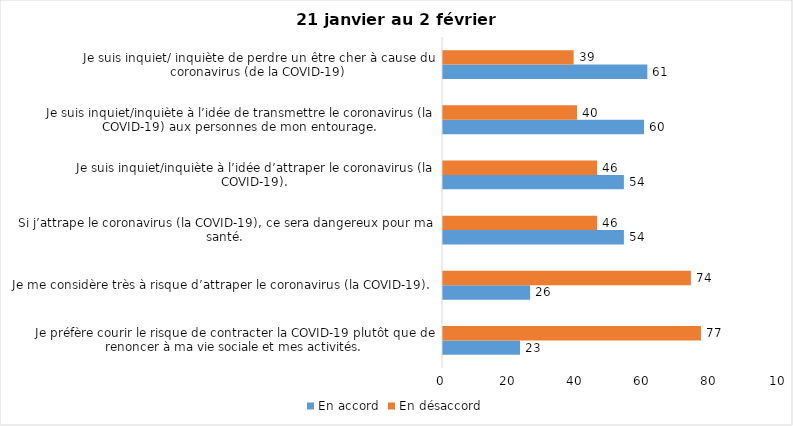
| Category | En accord | En désaccord |
|---|---|---|
| Je préfère courir le risque de contracter la COVID-19 plutôt que de renoncer à ma vie sociale et mes activités. | 23 | 77 |
| Je me considère très à risque d’attraper le coronavirus (la COVID-19). | 26 | 74 |
| Si j’attrape le coronavirus (la COVID-19), ce sera dangereux pour ma santé. | 54 | 46 |
| Je suis inquiet/inquiète à l’idée d’attraper le coronavirus (la COVID-19). | 54 | 46 |
| Je suis inquiet/inquiète à l’idée de transmettre le coronavirus (la COVID-19) aux personnes de mon entourage. | 60 | 40 |
| Je suis inquiet/ inquiète de perdre un être cher à cause du coronavirus (de la COVID-19) | 61 | 39 |